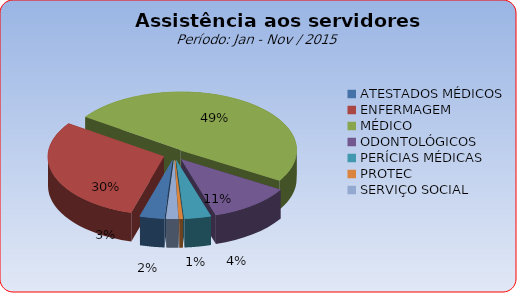
| Category | Series 0 |
|---|---|
| ATESTADOS MÉDICOS | 3.427 |
| ENFERMAGEM | 30.085 |
| MÉDICO | 49.095 |
| ODONTOLÓGICOS | 11.486 |
| PERÍCIAS MÉDICAS | 3.714 |
| PROTEC | 0.521 |
| SERVIÇO SOCIAL | 1.672 |